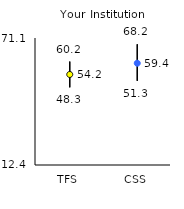
| Category | 25th | 75th | Mean |
|---|---|---|---|
| TFS | 48.3 | 60.2 | 54.24 |
| CSS | 51.3 | 68.2 | 59.44 |